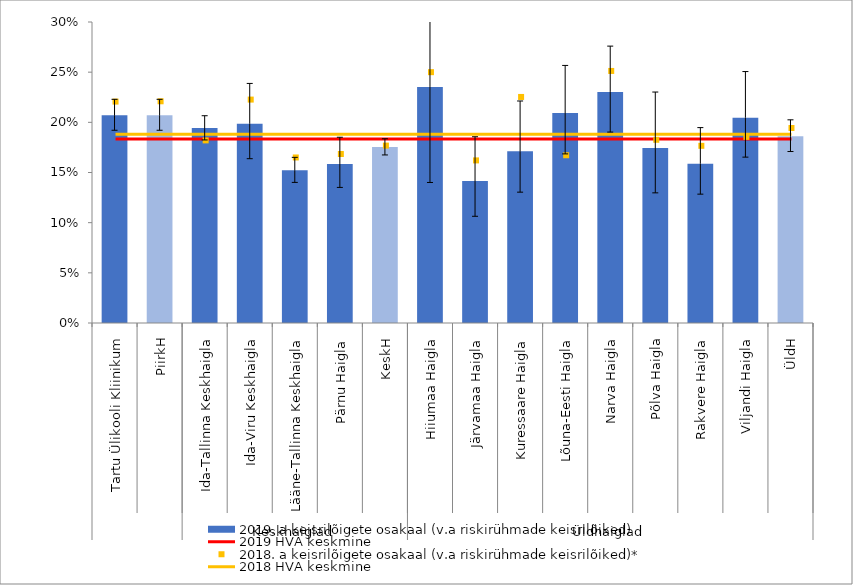
| Category | 2019. a keisrilõigete osakaal (v.a riskirühmade keisrilõiked) |
|---|---|
| 0 | 0.207 |
| 1 | 0.207 |
| 2 | 0.194 |
| 3 | 0.199 |
| 4 | 0.152 |
| 5 | 0.159 |
| 6 | 0.175 |
| 7 | 0.235 |
| 8 | 0.141 |
| 9 | 0.171 |
| 10 | 0.209 |
| 11 | 0.23 |
| 12 | 0.174 |
| 13 | 0.159 |
| 14 | 0.205 |
| 15 | 0.186 |